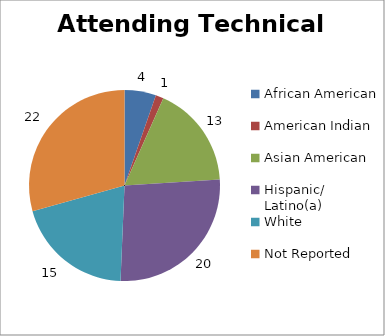
| Category | Attending Technical School |
|---|---|
| African American | 4 |
| American Indian | 1 |
| Asian American | 13 |
| Hispanic/ Latino(a) | 20 |
| White | 15 |
| Not Reported | 22 |